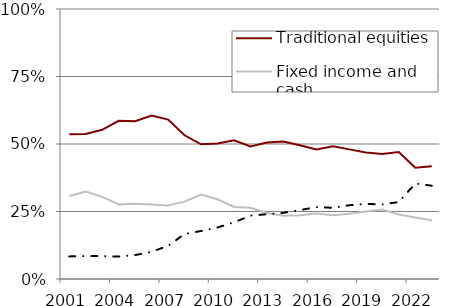
| Category | Traditional equities | Fixed income and cash | Alternatives |
|---|---|---|---|
| 2001.0 | 0.536 | 0.307 | 0.084 |
| 2002.0 | 0.537 | 0.324 | 0.085 |
| 2003.0 | 0.553 | 0.304 | 0.085 |
| 2004.0 | 0.586 | 0.276 | 0.083 |
| 2005.0 | 0.584 | 0.279 | 0.089 |
| 2006.0 | 0.605 | 0.276 | 0.101 |
| 2007.0 | 0.591 | 0.272 | 0.123 |
| 2008.0 | 0.532 | 0.286 | 0.167 |
| 2009.0 | 0.499 | 0.313 | 0.178 |
| 2010.0 | 0.502 | 0.295 | 0.191 |
| 2011.0 | 0.514 | 0.267 | 0.21 |
| 2012.0 | 0.491 | 0.264 | 0.234 |
| 2013.0 | 0.505 | 0.245 | 0.24 |
| 2014.0 | 0.509 | 0.234 | 0.245 |
| 2015.0 | 0.495 | 0.237 | 0.255 |
| 2016.0 | 0.48 | 0.242 | 0.266 |
| 2017.0 | 0.491 | 0.236 | 0.264 |
| 2018.0 | 0.48 | 0.242 | 0.273 |
| 2019.0 | 0.469 | 0.25 | 0.278 |
| 2020.0 | 0.463 | 0.257 | 0.276 |
| 2021.0 | 0.471 | 0.239 | 0.285 |
| 2022.0 | 0.412 | 0.227 | 0.354 |
| 2023.0 | 0.417 | 0.217 | 0.345 |